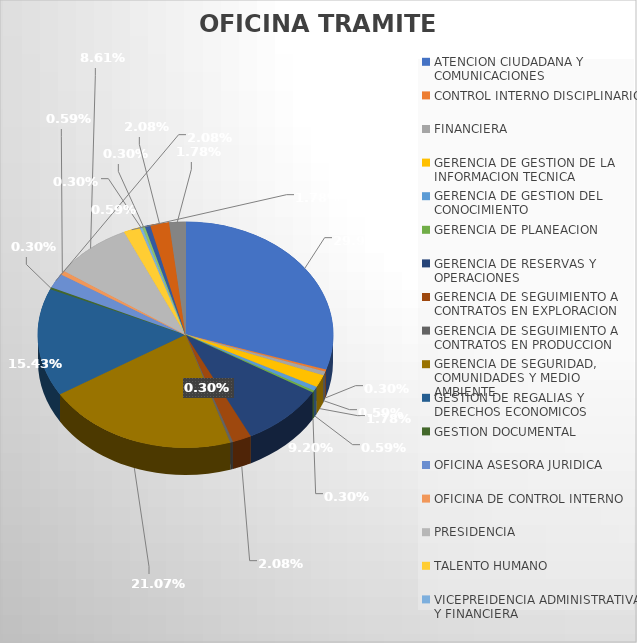
| Category | CANTIDAD |
|---|---|
| ATENCION CIUDADANA Y COMUNICACIONES | 101 |
| CONTROL INTERNO DISCIPLINARIO | 1 |
| FINANCIERA | 2 |
| GERENCIA DE GESTION DE LA INFORMACION TECNICA | 6 |
| GERENCIA DE GESTION DEL CONOCIMIENTO | 2 |
| GERENCIA DE PLANEACION | 1 |
| GERENCIA DE RESERVAS Y OPERACIONES | 31 |
| GERENCIA DE SEGUIMIENTO A CONTRATOS EN EXPLORACION | 7 |
| GERENCIA DE SEGUIMIENTO A CONTRATOS EN PRODUCCION | 1 |
| GERENCIA DE SEGURIDAD, COMUNIDADES Y MEDIO AMBIENTE | 71 |
| GESTION DE REGALIAS Y DERECHOS ECONOMICOS | 52 |
| GESTION DOCUMENTAL | 1 |
| OFICINA ASESORA JURIDICA | 7 |
| OFICINA DE CONTROL INTERNO | 2 |
| PRESIDENCIA | 29 |
| TALENTO HUMANO | 6 |
| VICEPREIDENCIA ADMINISTRATIVA Y FINANCIERA | 1 |
| VICEPRESIDENCIA ADMINISTRATIVA Y FINANCIERA | 1 |
| VICEPRESIDENCIA DE OPERACIONES, REGALIAS Y PARTICIPACIONES | 2 |
| VICEPRESIDENCIA PROMOCION Y ASIGNACION DE AREAS | 7 |
| VICEPRESIDENCIA TECNICA | 6 |